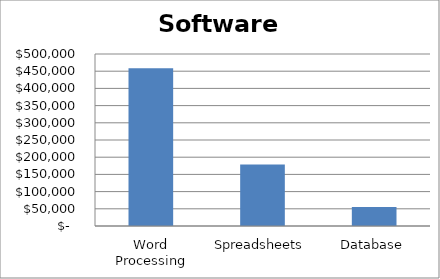
| Category | Series 0 |
|---|---|
| Word Processing | 458500 |
| Spreadsheets | 178500 |
| Database | 55500 |